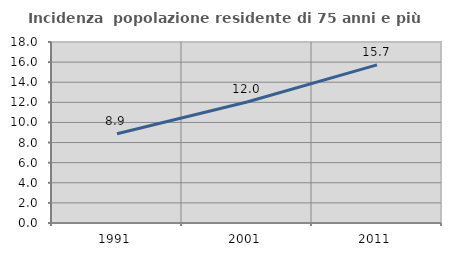
| Category | Incidenza  popolazione residente di 75 anni e più |
|---|---|
| 1991.0 | 8.881 |
| 2001.0 | 12.029 |
| 2011.0 | 15.72 |